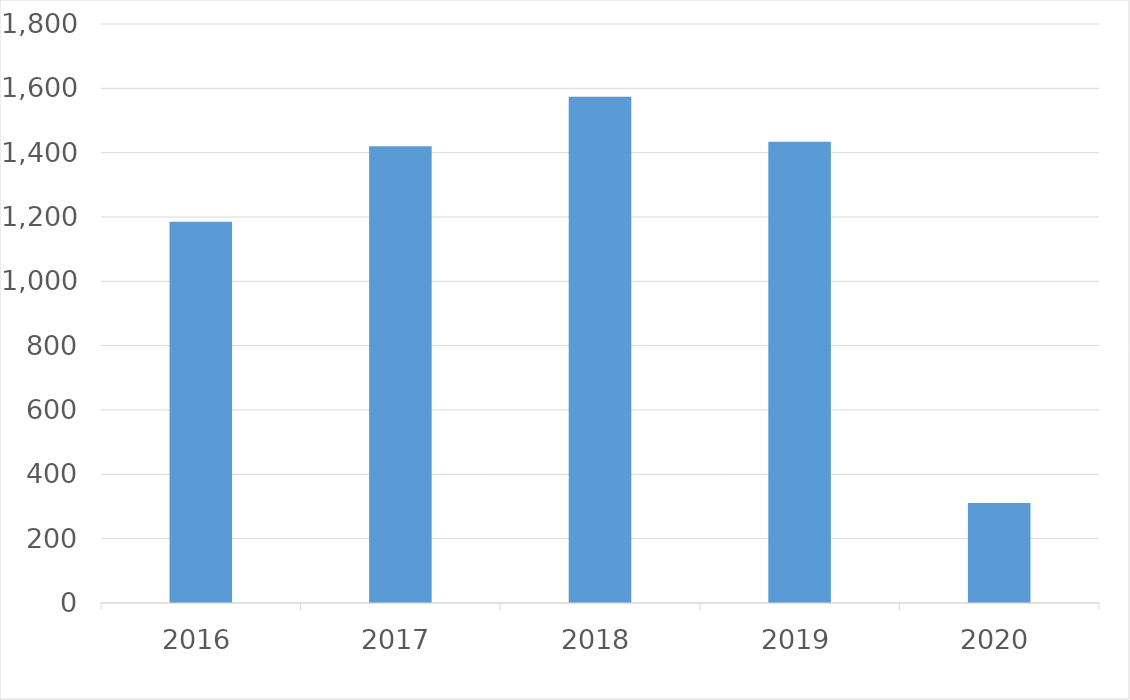
| Category | Series 0 |
|---|---|
| 2016 | 1185 |
| 2017 | 1420 |
| 2018 | 1574 |
| 2019 | 1434 |
| 2020 | 311 |